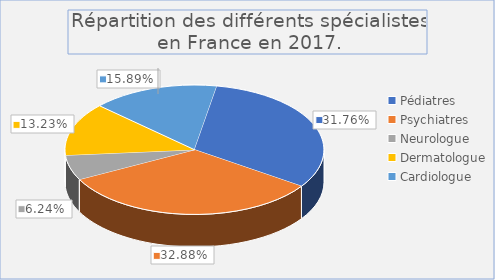
| Category | 2017 |
|---|---|
| Pédiatres | 1589 |
| Psychiatres | 1645 |
| Neurologue | 312 |
| Dermatologue | 662 |
| Cardiologue | 795 |